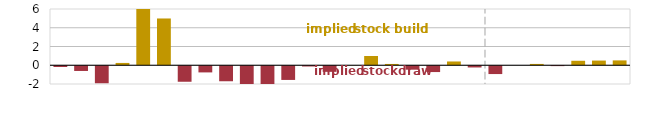
| Category | Series 2 | Series 0 |
|---|---|---|
| 2019-Q1 | -0.186 | 0 |
| 2019-Q2 | -0.61 | 0 |
| 2019-Q3 | -1.919 | 0 |
| 2019-Q4 | 0 | 0.247 |
| 2020-Q1 | 0 | 6.66 |
| 2020-Q2 | 0 | 4.989 |
| 2020-Q3 | -1.761 | 0 |
| 2020-Q4 | -0.763 | 0 |
| 2021-Q1 | -1.707 | 0 |
| 2021-Q2 | -2.287 | 0 |
| 2021-Q3 | -2.166 | 0 |
| 2021-Q4 | -1.566 | 0 |
| 2022-Q1 | -0.133 | 0 |
| 2022-Q2 | -0.704 | 0 |
| 2022-Q3 | 0 | 0.015 |
| 2022-Q4 | 0 | 0.99 |
| 2023-Q1 | 0 | 0.138 |
| 2023-Q2 | -0.473 | 0 |
| 2023-Q3 | -0.726 | 0 |
| 2023-Q4 | 0 | 0.403 |
| 2024-Q1 | -0.237 | 0 |
| 2024-Q2 | -0.94 | 0 |
| 2024-Q3 | -0.001 | 0 |
| 2024-Q4 | 0 | 0.14 |
| 2025-Q1 | -0.092 | 0 |
| 2025-Q2 | 0 | 0.477 |
| 2025-Q3 | 0 | 0.499 |
| 2025-Q4 | 0 | 0.517 |